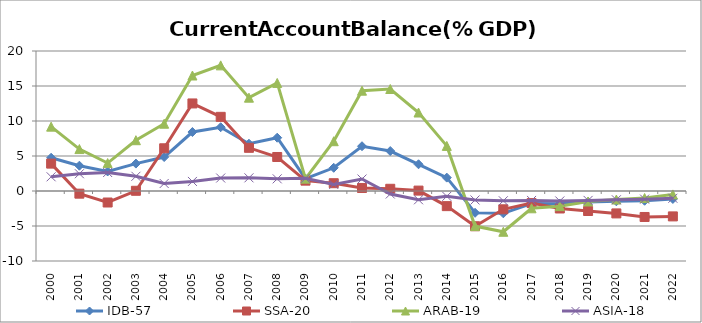
| Category | IDB-57 | SSA-20 | ARAB-19 | ASIA-18 |
|---|---|---|---|---|
| 2000.0 | 4.75 | 3.912 | 9.194 | 2.028 |
| 2001.0 | 3.614 | -0.381 | 5.989 | 2.465 |
| 2002.0 | 2.793 | -1.644 | 3.989 | 2.641 |
| 2003.0 | 3.917 | 0.031 | 7.255 | 2.102 |
| 2004.0 | 4.852 | 6.102 | 9.61 | 1.073 |
| 2005.0 | 8.425 | 12.507 | 16.498 | 1.365 |
| 2006.0 | 9.111 | 10.594 | 17.948 | 1.853 |
| 2007.0 | 6.753 | 6.169 | 13.332 | 1.881 |
| 2008.0 | 7.613 | 4.857 | 15.436 | 1.738 |
| 2009.0 | 1.76 | 1.479 | 1.764 | 1.81 |
| 2010.0 | 3.315 | 1.112 | 7.113 | 0.939 |
| 2011.0 | 6.394 | 0.431 | 14.332 | 1.708 |
| 2012.0 | 5.708 | 0.316 | 14.569 | -0.43 |
| 2013.0 | 3.819 | 0.058 | 11.212 | -1.256 |
| 2014.0 | 1.912 | -2.162 | 6.444 | -0.759 |
| 2015.0 | -3.112 | -5.035 | -5.011 | -1.285 |
| 2016.0 | -3.186 | -2.615 | -5.825 | -1.396 |
| 2017.0 | -1.801 | -1.728 | -2.47 | -1.349 |
| 2018.0 | -1.812 | -2.498 | -2.163 | -1.424 |
| 2019.0 | -1.574 | -2.859 | -1.5 | -1.344 |
| 2020.0 | -1.469 | -3.202 | -1.22 | -1.256 |
| 2021.0 | -1.395 | -3.712 | -1.003 | -1.161 |
| 2022.0 | -1.134 | -3.629 | -0.49 | -1.038 |